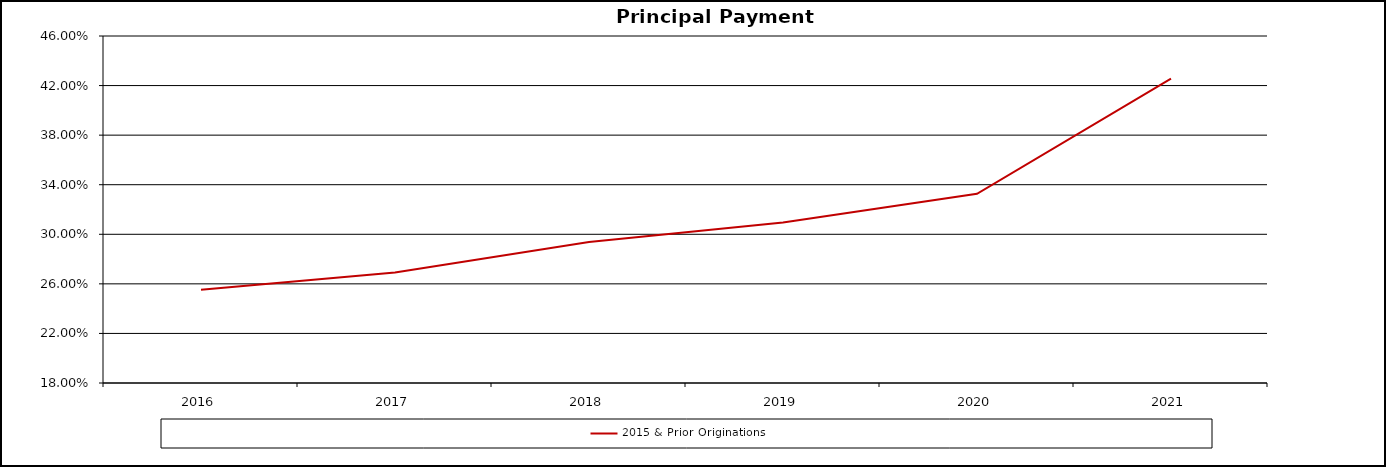
| Category | 2015 & Prior Originations |
|---|---|
| 2016.0 | 0.255 |
| 2017.0 | 0.269 |
| 2018.0 | 0.294 |
| 2019.0 | 0.31 |
| 2020.0 | 0.333 |
| 2021.0 | 0.426 |